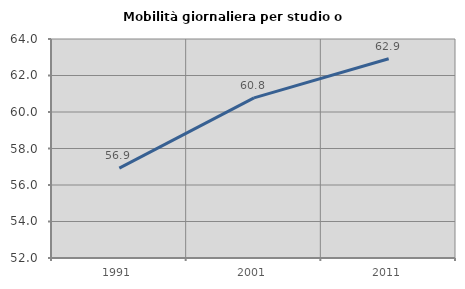
| Category | Mobilità giornaliera per studio o lavoro |
|---|---|
| 1991.0 | 56.926 |
| 2001.0 | 60.772 |
| 2011.0 | 62.919 |